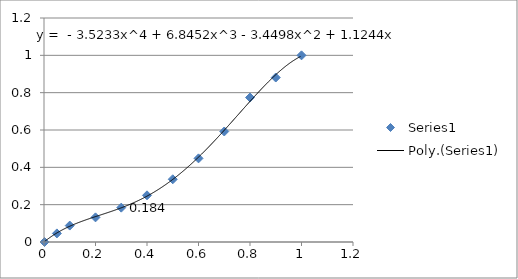
| Category | Series 0 |
|---|---|
| 1.0 | 1 |
| 0.9 | 0.881 |
| 0.8 | 0.774 |
| 0.7 | 0.592 |
| 0.6 | 0.448 |
| 0.5 | 0.336 |
| 0.4 | 0.25 |
| 0.3 | 0.184 |
| 0.2 | 0.132 |
| 0.1 | 0.088 |
| 0.05 | 0.046 |
| 0.002 | 0 |